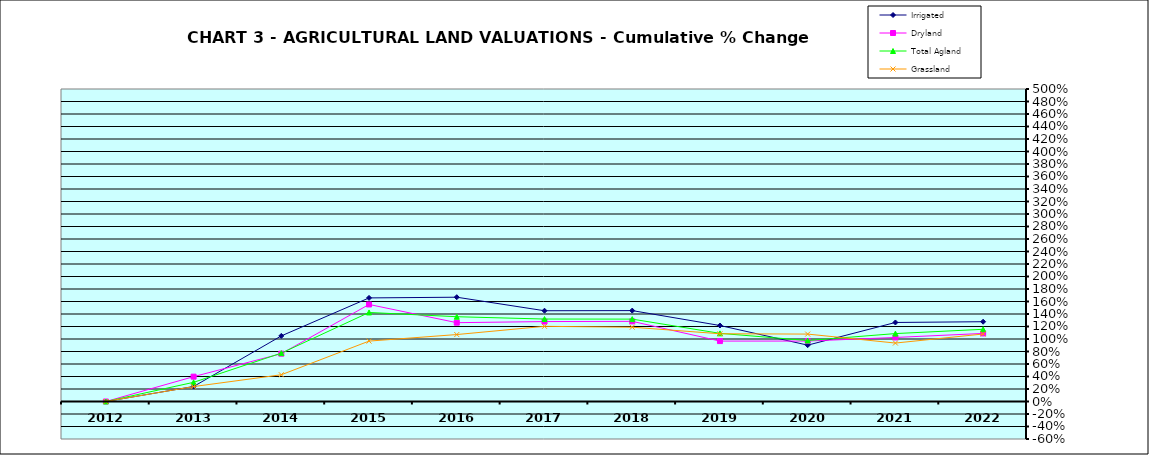
| Category | Irrigated | Dryland | Total Agland | Grassland |
|---|---|---|---|---|
| 2012.0 | 0 | 0 | 0 | 0 |
| 2013.0 | 0.24 | 0.397 | 0.307 | 0.239 |
| 2014.0 | 1.05 | 0.765 | 0.774 | 0.428 |
| 2015.0 | 1.657 | 1.553 | 1.425 | 0.966 |
| 2016.0 | 1.669 | 1.261 | 1.356 | 1.071 |
| 2017.0 | 1.452 | 1.279 | 1.319 | 1.203 |
| 2018.0 | 1.454 | 1.282 | 1.318 | 1.189 |
| 2019.0 | 1.216 | 0.967 | 1.09 | 1.084 |
| 2020.0 | 0.902 | 0.967 | 0.975 | 1.079 |
| 2021.0 | 1.264 | 1.025 | 1.087 | 0.935 |
| 2022.0 | 1.277 | 1.089 | 1.155 | 1.08 |